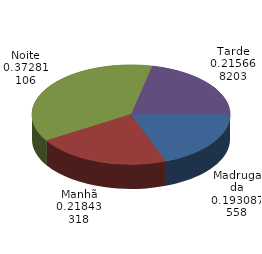
| Category | Qtde Vítimas |
|---|---|
| Madrugada | 419 |
| Manhã | 474 |
| Noite | 809 |
| Tarde | 468 |